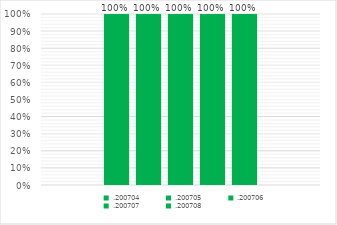
| Category | .200704 | .200705 | .200706 | .200707 | .200708 |
|---|---|---|---|---|---|
| 0 | 1 | 1 | 1 | 1 | 1 |